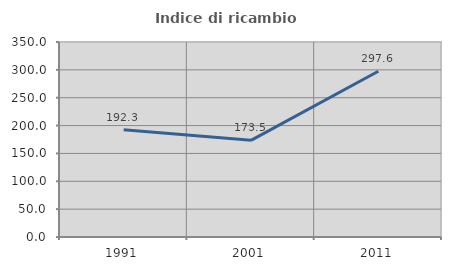
| Category | Indice di ricambio occupazionale  |
|---|---|
| 1991.0 | 192.308 |
| 2001.0 | 173.529 |
| 2011.0 | 297.561 |